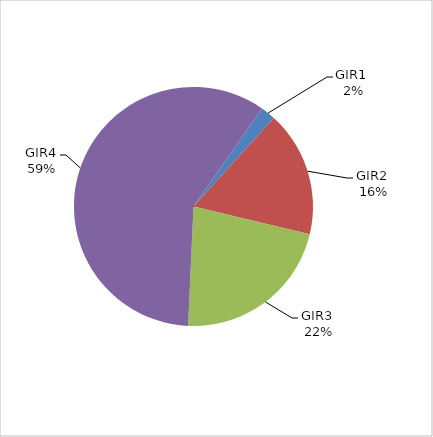
| Category | Series 0 |
|---|---|
| GIR1 | 0.02 |
| GIR2 | 0.17 |
| GIR3 | 0.22 |
| GIR4 | 0.59 |